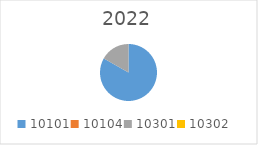
| Category | Series 0 |
|---|---|
| 10101.0 | 5882362 |
| 10104.0 | 0 |
| 10301.0 | 1186000 |
| 10302.0 | 0 |